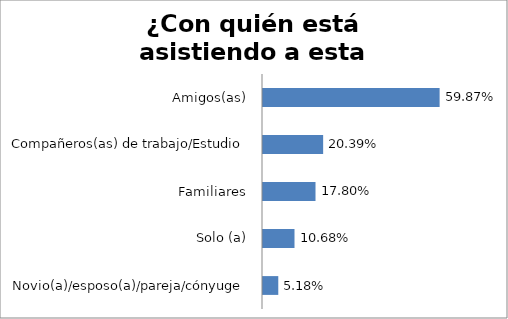
| Category | Series 0 |
|---|---|
| Novio(a)/esposo(a)/pareja/cónyuge | 0.052 |
| Solo (a) | 0.107 |
| Familiares | 0.178 |
| Compañeros(as) de trabajo/Estudio | 0.204 |
| Amigos(as) | 0.599 |